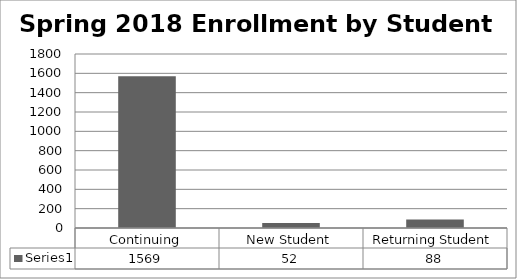
| Category | Series 0 |
|---|---|
| Continuing | 1569 |
| New Student | 52 |
| Returning Student | 88 |